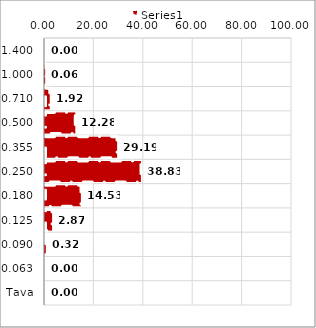
| Category | Series 0 |
|---|---|
| 1,400 | 0 |
| 1,000 | 0.06 |
| 0,710 | 1.92 |
| 0,500 | 12.28 |
| 0,355 | 29.19 |
| 0,250 | 38.83 |
| 0,180 | 14.53 |
| 0,125 | 2.87 |
| 0,090 | 0.32 |
| 0,063 | 0 |
| Tava | 0 |